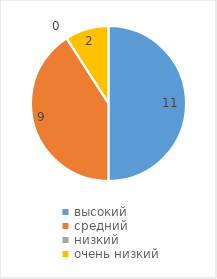
| Category | Series 0 |
|---|---|
| высокий | 11 |
| средний | 9 |
| низкий | 0 |
| очень низкий | 2 |